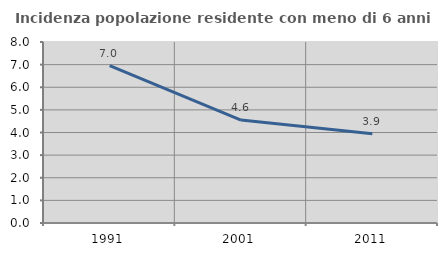
| Category | Incidenza popolazione residente con meno di 6 anni |
|---|---|
| 1991.0 | 6.954 |
| 2001.0 | 4.552 |
| 2011.0 | 3.94 |